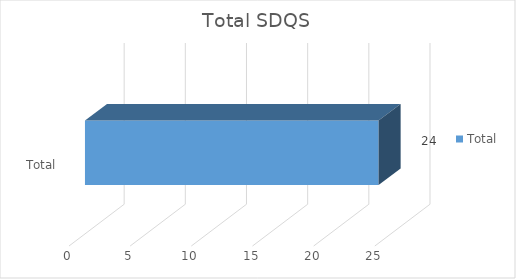
| Category | Total |
|---|---|
| Total | 24 |